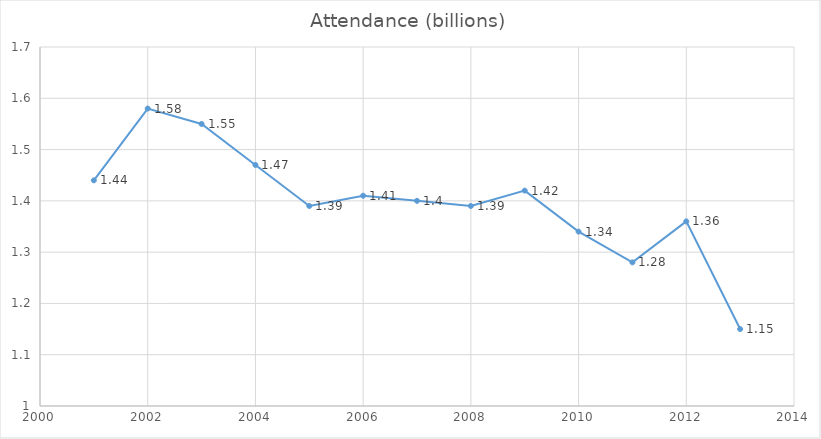
| Category | Attendance (billions) |
|---|---|
| 2001.0 | 1.44 |
| 2002.0 | 1.58 |
| 2003.0 | 1.55 |
| 2004.0 | 1.47 |
| 2005.0 | 1.39 |
| 2006.0 | 1.41 |
| 2007.0 | 1.4 |
| 2008.0 | 1.39 |
| 2009.0 | 1.42 |
| 2010.0 | 1.34 |
| 2011.0 | 1.28 |
| 2012.0 | 1.36 |
| 2013.0 | 1.15 |